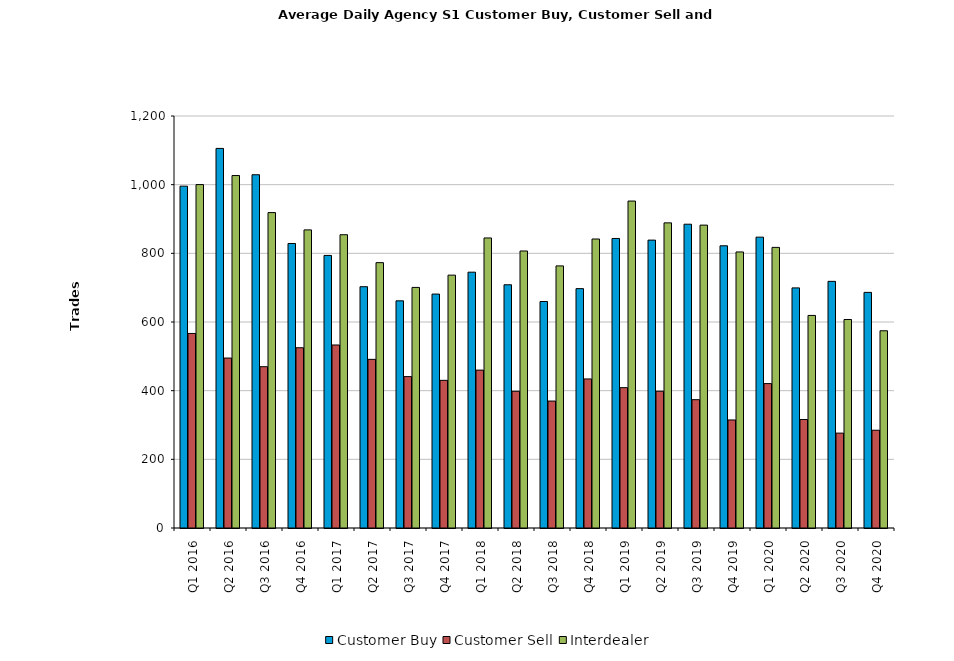
| Category | Customer Buy | Customer Sell | Interdealer |
|---|---|---|---|
| Q1 2016 | 995.656 | 566.607 | 1000.246 |
| Q2 2016 | 1105.578 | 494.969 | 1026.594 |
| Q3 2016 | 1028.922 | 469.828 | 918.625 |
| Q4 2016 | 828.651 | 525.016 | 868.317 |
| Q1 2017 | 793.887 | 533.016 | 854.177 |
| Q2 2017 | 702.762 | 491.206 | 772.857 |
| Q3 2017 | 661.651 | 440.937 | 700.746 |
| Q4 2017 | 681.365 | 430.111 | 736.524 |
| Q1 2018 | 745.098 | 459.869 | 844.754 |
| Q2 2018 | 708.406 | 398.219 | 806.812 |
| Q3 2018 | 659.667 | 369.762 | 763.397 |
| Q4 2018 | 697.19 | 434.127 | 841.746 |
| Q1 2019 | 843.295 | 408.787 | 952.246 |
| Q2 2019 | 838.492 | 398.349 | 888.746 |
| Q3 2019 | 884.844 | 373.766 | 882.172 |
| Q4 2019 | 821.906 | 314.656 | 804 |
| Q1 2020 | 847.161 | 420.581 | 817.339 |
| Q2 2020 | 699.365 | 315.984 | 619.127 |
| Q3 2020 | 718.391 | 276.359 | 607.312 |
| Q4 2020 | 686.266 | 284.797 | 574.438 |